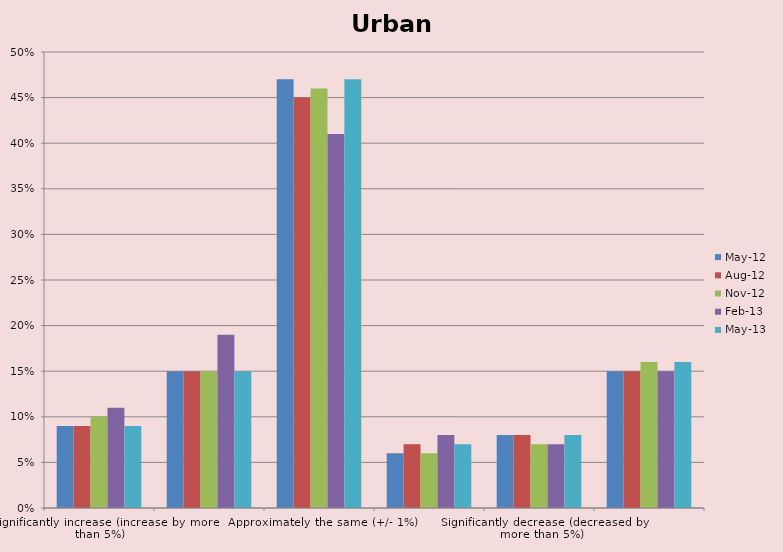
| Category | May-12 | Aug-12 | Nov-12 | Feb-13 | May-13 |
|---|---|---|---|---|---|
| Significantly increase (increase by more than 5%) | 0.09 | 0.09 | 0.1 | 0.11 | 0.09 |
| Slightly increase (increased by 1% - 5%) | 0.15 | 0.15 | 0.15 | 0.19 | 0.15 |
| Approximately the same (+/- 1%) | 0.47 | 0.45 | 0.46 | 0.41 | 0.47 |
| Slightly decrease (decreased by 1% - 5%) | 0.06 | 0.07 | 0.06 | 0.08 | 0.07 |
| Significantly decrease (decreased by more than 5%) | 0.08 | 0.08 | 0.07 | 0.07 | 0.08 |
| Unsure/not applicable | 0.15 | 0.15 | 0.16 | 0.15 | 0.16 |